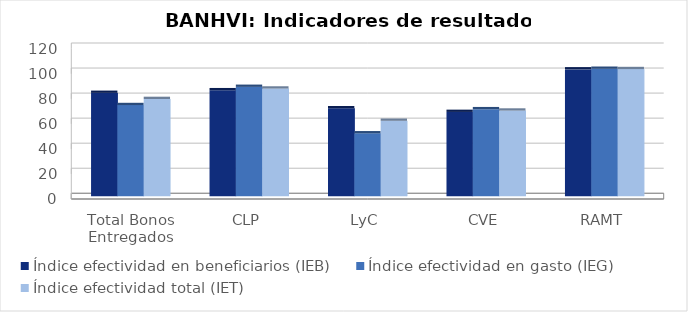
| Category | Índice efectividad en beneficiarios (IEB) | Índice efectividad en gasto (IEG)  | Índice efectividad total (IET) |
|---|---|---|---|
| Total Bonos Entregados | 82.467 | 72.725 | 77.596 |
| CLP | 84.563 | 87.273 | 85.918 |
| LyC | 70.16 | 50.167 | 60.164 |
| CVE | 67.255 | 69.407 | 68.331 |
| RAMT | 101.223 | 101.701 | 101.462 |